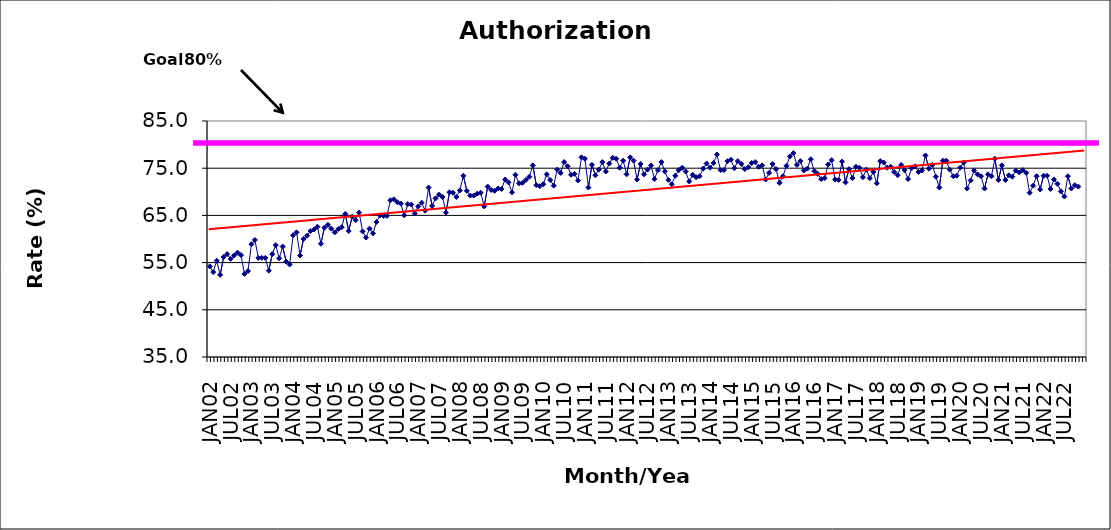
| Category | Series 0 |
|---|---|
| JAN02 | 54.2 |
| FEB02 | 53 |
| MAR02 | 55.4 |
| APR02 | 52.4 |
| MAY02 | 56.2 |
| JUN02 | 56.8 |
| JUL02 | 55.8 |
| AUG02 | 56.5 |
| SEP02 | 57.1 |
| OCT02 | 56.6 |
| NOV02 | 52.6 |
| DEC02 | 53.2 |
| JAN03 | 58.9 |
| FEB03 | 59.8 |
| MAR03 | 56 |
| APR03 | 56 |
| MAY03 | 56 |
| JUN03 | 53.3 |
| JUL03 | 56.8 |
| AUG03 | 58.7 |
| SEP03 | 55.9 |
| OCT03 | 58.4 |
| NOV03 | 55.2 |
| DEC03 | 54.6 |
| JAN04 | 60.8 |
| FEB04 | 61.4 |
| MAR04 | 56.5 |
| APR04 | 60 |
| MAY04 | 60.7 |
| JUN04 | 61.7 |
| JUL04 | 62 |
| AUG04 | 62.6 |
| SEP04 | 59 |
| OCT04 | 62.4 |
| NOV04 | 63 |
| DEC04 | 62.2 |
| JAN05 | 61.4 |
| FEB05 | 62.1 |
| MAR05 | 62.5 |
| APR05 | 65.3 |
| MAY05 | 61.7 |
| JUN05 | 64.7 |
| JUL05 | 64 |
| AUG05 | 65.6 |
| SEP05 | 61.6 |
| OCT05 | 60.3 |
| NOV05 | 62.2 |
| DEC05 | 61.2 |
| JAN06 | 63.6 |
| FEB06 | 65 |
| MAR06 | 64.9 |
| APR06 | 64.9 |
| MAY06 | 68.2 |
| JUN06 | 68.4 |
| JUL06 | 67.8 |
| AUG06 | 67.5 |
| SEP06 | 65 |
| OCT06 | 67.4 |
| NOV06 | 67.3 |
| DEC06 | 65.4 |
| JAN07 | 66.9 |
| FEB07 | 67.7 |
| MAR07 | 66 |
| APR07 | 70.9 |
| MAY07 | 67 |
| JUN07 | 68.6 |
| JUL07 | 69.4 |
| AUG07 | 68.9 |
| SEP07 | 65.6 |
| OCT07 | 69.9 |
| NOV07 | 69.8 |
| DEC07 | 68.9 |
| JAN08 | 70.3 |
| FEB08 | 73.4 |
| MAR08 | 70.2 |
| APR08 | 69.2 |
| MAY08 | 69.2 |
| JUN08 | 69.6 |
| JUL08 | 69.8 |
| AUG08 | 66.9 |
| SEP08 | 71.1 |
| OCT08 | 70.4 |
| NOV08 | 70.2 |
| DEC08 | 70.7 |
| JAN09 | 70.6 |
| FEB09 | 72.6 |
| MAR09 | 72 |
| APR09 | 69.9 |
| MAY09 | 73.6 |
| JUN09 | 71.8 |
| JUL09 | 71.9 |
| AUG09 | 72.5 |
| SEP09 | 73.2 |
| OCT09 | 75.6 |
| NOV09 | 71.4 |
| DEC09 | 71.2 |
| JAN10 | 71.6 |
| FEB10 | 73.7 |
| MAR10 | 72.5 |
| APR10 | 71.3 |
| MAY10 | 74.7 |
| JUN10 | 74 |
| JUL10 | 76.3 |
| AUG10 | 75.4 |
| SEP10 | 73.6 |
| OCT10 | 73.8 |
| NOV10 | 72.4 |
| DEC10 | 77.3 |
| JAN11 | 77 |
| FEB11 | 70.9 |
| MAR11 | 75.7 |
| APR11 | 73.5 |
| MAY11 | 74.7 |
| JUN11 | 76.3 |
| JUL11 | 74.3 |
| AUG11 | 76 |
| SEP11 | 77.2 |
| OCT11 | 77 |
| NOV11 | 75.1 |
| DEC11 | 76.6 |
| JAN12 | 73.7 |
| FEB12 | 77.3 |
| MAR12 | 76.6 |
| APR12 | 72.6 |
| MAY12 | 75.9 |
| JUN12 | 73.7 |
| JUL12 | 74.7 |
| AUG12 | 75.6 |
| SEP12 | 72.7 |
| OCT12 | 74.6 |
| NOV12 | 76.3 |
| DEC12 | 74.3 |
| JAN13 | 72.5 |
| FEB13 | 71.6 |
| MAR13 | 73.4 |
| APR13 | 74.6 |
| MAY13 | 75.1 |
| JUN13 | 74.3 |
| JUL13 | 72.2 |
| AUG13 | 73.6 |
| SEP13 | 73.1 |
| OCT13 | 73.3 |
| NOV13 | 74.9 |
| DEC13 | 76 |
| JAN14 | 75.1 |
| FEB14 | 76.1 |
| MAR14 | 77.9 |
| APR14 | 74.6 |
| MAY14 | 74.6 |
| JUN14 | 76.5 |
| JUL14 | 76.8 |
| AUG14 | 75 |
| SEP14 | 76.5 |
| OCT14 | 75.9 |
| NOV14 | 74.8 |
| DEC14 | 75.2 |
| JAN15 | 76.1 |
| FEB15 | 76.3 |
| MAR15 | 75.3 |
| APR15 | 75.6 |
| MAY15 | 72.6 |
| JUN15 | 74 |
| JUL15 | 75.9 |
| AUG15 | 74.8 |
| SEP15 | 71.9 |
| OCT15 | 73.3 |
| NOV15 | 75.5 |
| DEC15 | 77.5 |
| JAN16 | 78.2 |
| FEB16 | 75.7 |
| MAR16 | 76.5 |
| APR16 | 74.5 |
| MAY16 | 74.9 |
| JUN16 | 76.9 |
| JUL16 | 74.4 |
| AUG16 | 73.8 |
| SEP16 | 72.7 |
| OCT16 | 72.9 |
| NOV16 | 75.8 |
| DEC16 | 76.7 |
| JAN17 | 72.6 |
| FEB17 | 72.5 |
| MAR17 | 76.4 |
| APR17 | 72 |
| MAY17 | 74.8 |
| JUN17 | 72.9 |
| JUL17 | 75.3 |
| AUG17 | 75.1 |
| SEP17 | 73.1 |
| OCT17 | 74.7 |
| NOV17 | 72.9 |
| DEC17 | 74.2 |
| JAN18 | 71.8 |
| FEB18 | 76.5 |
| MAR18 | 76.2 |
| APR18 | 75.1 |
| MAY18 | 75.3 |
| JUN18 | 74.2 |
| JUL18 | 73.5 |
| AUG18 | 75.7 |
| SEP18 | 74.6 |
| OCT18 | 72.7 |
| NOV18 | 75 |
| DEC18 | 75.4 |
| JAN19 | 74.2 |
| FEB19 | 74.5 |
| MAR19 | 77.7 |
| APR19 | 74.9 |
| MAY19 | 75.7 |
| JUN19 | 73.2 |
| JUL19 | 70.9 |
| AUG19 | 76.6 |
| SEP19 | 76.6 |
| OCT19 | 74.7 |
| NOV19 | 73.3 |
| DEC19 | 73.4 |
| JAN20 | 75.1 |
| FEB20 | 76.2 |
| MAR20 | 70.7 |
| APR20 | 72.4 |
| MAY20 | 74.5 |
| JUN20 | 73.7 |
| JUL20 | 73.3 |
| AUG20 | 70.7 |
| SEP20 | 73.7 |
| OCT20 | 73.3 |
| NOV20 | 77 |
| DEC20 | 72.5 |
| JAN21 | 75.6 |
| FEB21 | 72.5 |
| MAR21 | 73.5 |
| APR21 | 73.2 |
| MAY21 | 74.5 |
| JUN21 | 74.1 |
| JUL21 | 74.6 |
| AUG21 | 74 |
| SEP21 | 69.8 |
| OCT21 | 71.3 |
| NOV21 | 73.3 |
| DEC21 | 70.5 |
| JAN22 | 73.4 |
| FEB22 | 73.4 |
| MAR22 | 70.6 |
| APR22 | 72.6 |
| MAY22 | 71.7 |
| JUN22 | 70.1 |
| JUL22 | 69 |
| AUG22 | 73.3 |
| SEP22 | 70.7 |
| OCT22 | 71.4 |
| NOV22 | 71.1 |